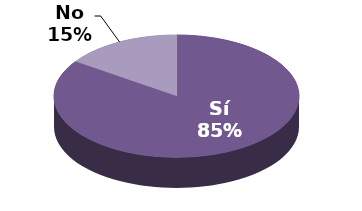
| Category | Series 1 |
|---|---|
| Sí | 11 |
| No | 2 |